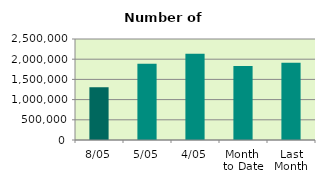
| Category | Series 0 |
|---|---|
| 8/05 | 1307834 |
| 5/05 | 1887118 |
| 4/05 | 2132434 |
| Month 
to Date | 1832012.4 |
| Last
Month | 1909115.889 |